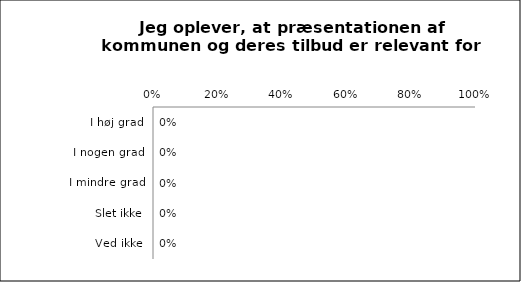
| Category | Præsentationen af kommunen og deres tilbud er relevant for mig |
|---|---|
| I høj grad | 0 |
| I nogen grad | 0 |
| I mindre grad | 0 |
| Slet ikke | 0 |
| Ved ikke | 0 |